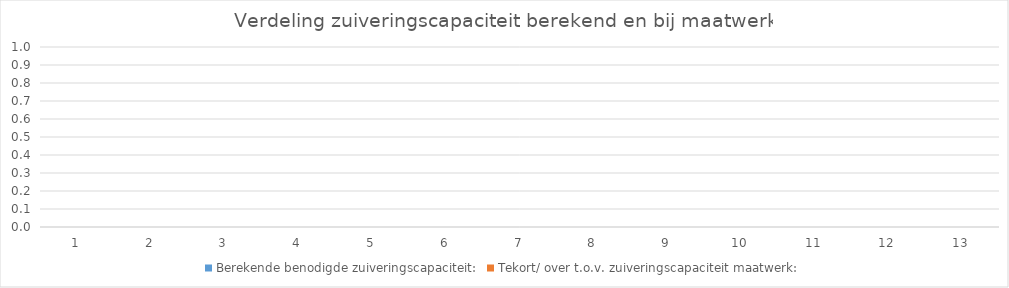
| Category | Berekende benodigde zuiveringscapaciteit: | Tekort/ over t.o.v. zuiveringscapaciteit maatwerk: |
|---|---|---|
| 0 | 0 | 0 |
| 1 | 0 | 0 |
| 2 | 0 | 0 |
| 3 | 0 | 0 |
| 4 | 0 | 0 |
| 5 | 0 | 0 |
| 6 | 0 | 0 |
| 7 | 0 | 0 |
| 8 | 0 | 0 |
| 9 | 0 | 0 |
| 10 | 0 | 0 |
| 11 | 0 | 0 |
| 12 | 0 | 0 |